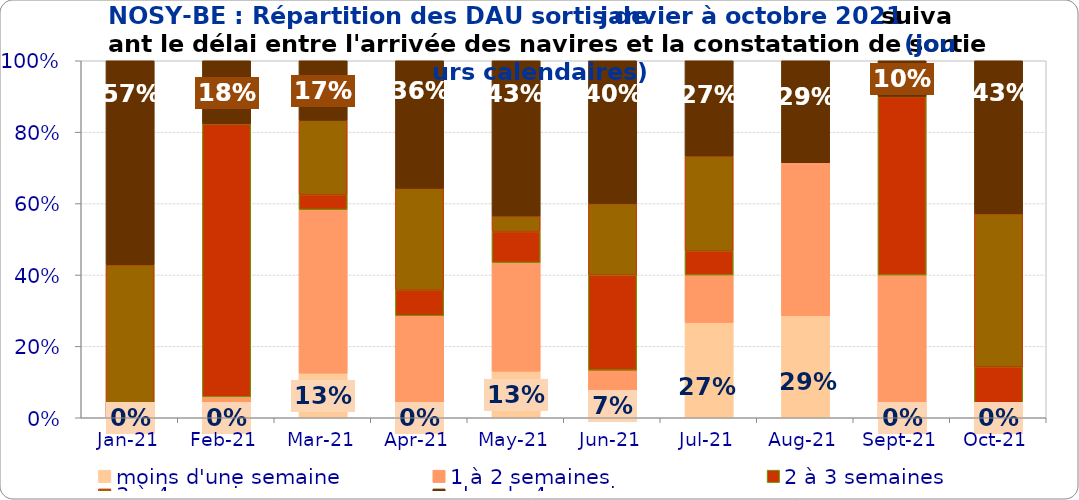
| Category | moins d'une semaine | 1 à 2 semaines | 2 à 3 semaines | 3 à 4 semaines | plus de 4 semaines |
|---|---|---|---|---|---|
| 2021-01-01 | 0 | 0 | 0 | 0.429 | 0.571 |
| 2021-02-01 | 0 | 0.059 | 0.765 | 0 | 0.176 |
| 2021-03-01 | 0.125 | 0.458 | 0.042 | 0.208 | 0.167 |
| 2021-04-01 | 0 | 0.286 | 0.071 | 0.286 | 0.357 |
| 2021-05-01 | 0.13 | 0.304 | 0.087 | 0.043 | 0.435 |
| 2021-06-01 | 0.067 | 0.067 | 0.267 | 0.2 | 0.4 |
| 2021-07-01 | 0.267 | 0.133 | 0.067 | 0.267 | 0.267 |
| 2021-08-01 | 0.286 | 0.429 | 0 | 0 | 0.286 |
| 2021-09-01 | 0 | 0.4 | 0.5 | 0 | 0.1 |
| 2021-10-01 | 0 | 0 | 0.143 | 0.429 | 0.429 |